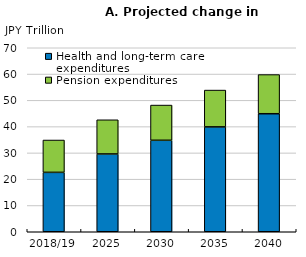
| Category | Health and long-term care expenditures | Pension expenditures |
|---|---|---|
| 2018/19 | 22.6 | 12.3 |
| 2025 | 29.6 | 13 |
| 2030 | 34.8 | 13.4 |
| 2035 | 39.9 | 14 |
| 2040 | 44.9 | 14.9 |